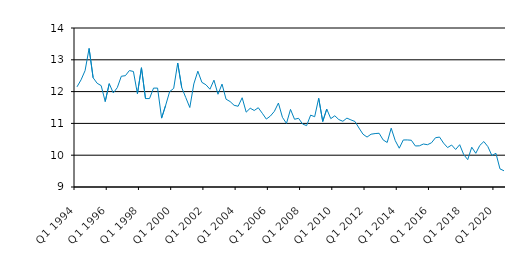
| Category | Series 0 |
|---|---|
| Q1 1994 | 12.15 |
| Q2 1994 | 12.369 |
| Q3 1994 | 12.659 |
| Q4 1994 | 13.357 |
| Q1 1995 | 12.435 |
| Q2 1995 | 12.262 |
| Q3 1995 | 12.188 |
| Q4 1995 | 11.688 |
| Q1 1996 | 12.25 |
| Q2 1996 | 11.958 |
| Q3 1996 | 12.125 |
| Q4 1996 | 12.483 |
| Q1 1997 | 12.5 |
| Q2 1997 | 12.662 |
| Q3 1997 | 12.633 |
| Q4 1997 | 11.933 |
| Q1 1998 | 12.75 |
| Q2 1998 | 11.781 |
| Q3 1998 | 11.781 |
| Q4 1998 | 12.11 |
| Q1 1999 | 12.11 |
| Q2 1999 | 11.166 |
| Q3 1999 | 11.566 |
| Q4 1999 | 12 |
| Q1 2000 | 12.1 |
| Q2 2000 | 12.899 |
| Q3 2000 | 12.125 |
| Q4 2000 | 11.812 |
| Q1 2001 | 11.5 |
| Q2 2001 | 12.241 |
| Q3 2001 | 12.642 |
| Q4 2001 | 12.291 |
| Q1 2002 | 12.215 |
| Q2 2002 | 12.075 |
| Q3 2002 | 12.36 |
| Q4 2002 | 11.917 |
| Q1 2003 | 12.236 |
| Q2 2003 | 11.761 |
| Q3 2003 | 11.688 |
| Q4 2003 | 11.569 |
| Q1 2004 | 11.539 |
| Q2 2004 | 11.807 |
| Q3 2004 | 11.354 |
| Q4 2004 | 11.477 |
| Q1 2005 | 11.406 |
| Q2 2005 | 11.493 |
| Q3 2005 | 11.318 |
| Q4 2005 | 11.136 |
| Q1 2006 | 11.231 |
| Q2 2006 | 11.38 |
| Q3 2006 | 11.64 |
| Q4 2006 | 11.19 |
| Q1 2007 | 11 |
| Q2 2007 | 11.44 |
| Q3 2007 | 11.13 |
| Q4 2007 | 11.16 |
| Q1 2008 | 10.98 |
| Q2 2008 | 10.93 |
| Q3 2008 | 11.26 |
| Q4 2008 | 11.21 |
| Q1 2009 | 11.79 |
| Q2 2009 | 11.06 |
| Q3 2009 | 11.45 |
| Q4 2009 | 11.15 |
| Q1 2010 | 11.24 |
| Q2 2010 | 11.12 |
| Q3 2010 | 11.067 |
| Q4 2010 | 11.166 |
| Q1 2011 | 11.11 |
| Q2 2011 | 11.06 |
| Q3 2011 | 10.855 |
| Q4 2011 | 10.66 |
| Q1 2012 | 10.57 |
| Q2 2012 | 10.66 |
| Q3 2012 | 10.68 |
| Q4 2012 | 10.69 |
| Q1 2013 | 10.48 |
| Q2 2013 | 10.4 |
| Q3 2013 | 10.85 |
| Q4 2013 | 10.46 |
| Q1 2014 | 10.22 |
| Q2 2014 | 10.479 |
| Q3 2014 | 10.48 |
| Q4 2014 | 10.47 |
| Q1 2015 | 10.29 |
| Q2 2015 | 10.295 |
| Q3 2015 | 10.352 |
| Q4 2015 | 10.33 |
| Q1 2016 | 10.39 |
| Q2 2016 | 10.55 |
| Q3 2016 | 10.57 |
| Q4 2016 | 10.38 |
| Q1 2017 | 10.24 |
| Q2 2017 | 10.32 |
| Q3 2017 | 10.18 |
| Q4 2017 | 10.33 |
| Q1 2018 | 10.02 |
| Q2 2018 | 9.86 |
| Q3 2018 | 10.251 |
| Q4 2018 | 10.06 |
| Q1 2019 | 10.308 |
| Q2 2019 | 10.429 |
| Q3 2019 | 10.27 |
| Q4 2019* | 9.99 |
| Q1 2020 | 10.06 |
| Q2 2020 | 9.57 |
| Q3 2020 | 9.51 |